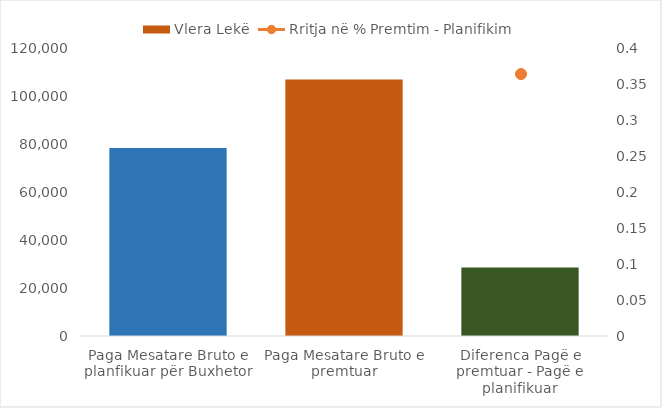
| Category | Vlera Lekë |
|---|---|
| Paga Mesatare Bruto e planfikuar për Buxhetor | 78571.161 |
| Paga Mesatare Bruto e premtuar | 107257 |
| Diferenca Pagë e premtuar - Pagë e planifikuar | 28685.839 |